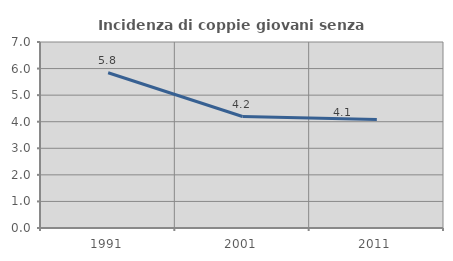
| Category | Incidenza di coppie giovani senza figli |
|---|---|
| 1991.0 | 5.842 |
| 2001.0 | 4.196 |
| 2011.0 | 4.086 |